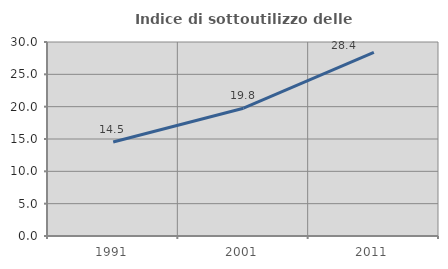
| Category | Indice di sottoutilizzo delle abitazioni  |
|---|---|
| 1991.0 | 14.538 |
| 2001.0 | 19.758 |
| 2011.0 | 28.38 |